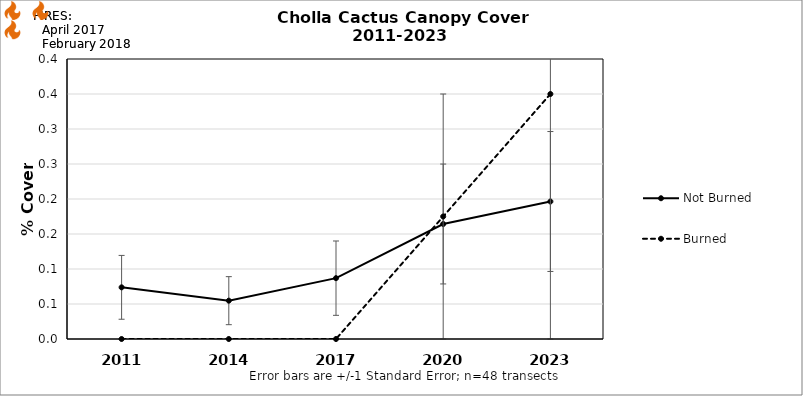
| Category | Not Burned | Burned |
|---|---|---|
| 2011.0 | 0.074 | 0 |
| 2014.0 | 0.055 | 0 |
| 2017.0 | 0.087 | 0 |
| 2020.0 | 0.164 | 0.175 |
| 2023.0 | 0.196 | 0.35 |